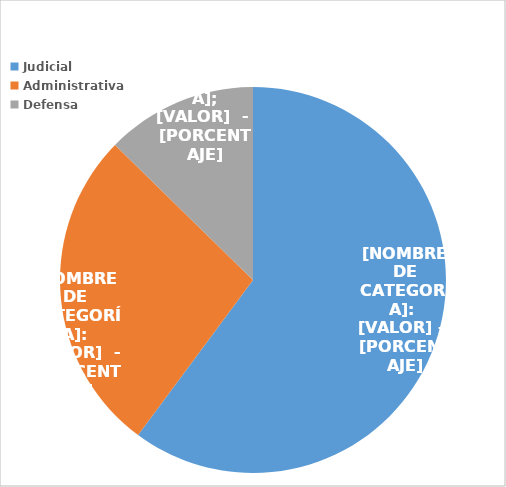
| Category | Series 0 |
|---|---|
| Judicial | 3336 |
| Administrativa | 1507 |
| Defensa | 703 |